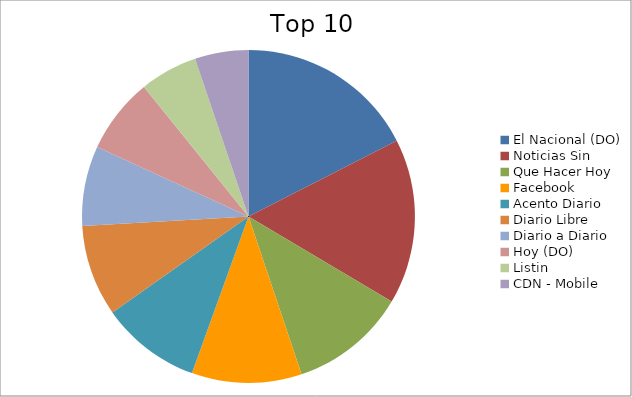
| Category | Series 0 |
|---|---|
| El Nacional (DO) | 6.89 |
| Noticias Sin | 6.33 |
| Que Hacer Hoy | 4.46 |
| Facebook | 4.21 |
| Acento Diario | 3.83 |
| Diario Libre | 3.49 |
| Diario a Diario | 3.06 |
| Hoy (DO) | 2.9 |
| Listin | 2.21 |
| CDN - Mobile | 2.05 |